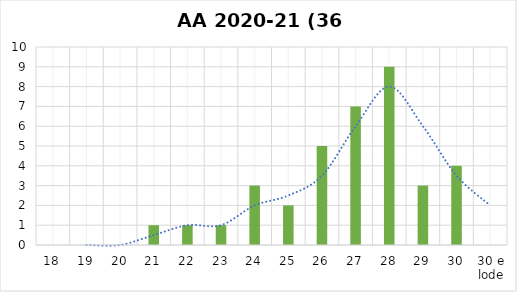
| Category | Series 0 |
|---|---|
| 18 | 0 |
| 19 | 0 |
| 20 | 0 |
| 21 | 1 |
| 22 | 1 |
| 23 | 1 |
| 24 | 3 |
| 25 | 2 |
| 26 | 5 |
| 27 | 7 |
| 28 | 9 |
| 29 | 3 |
| 30 | 4 |
| 30 e lode | 0 |